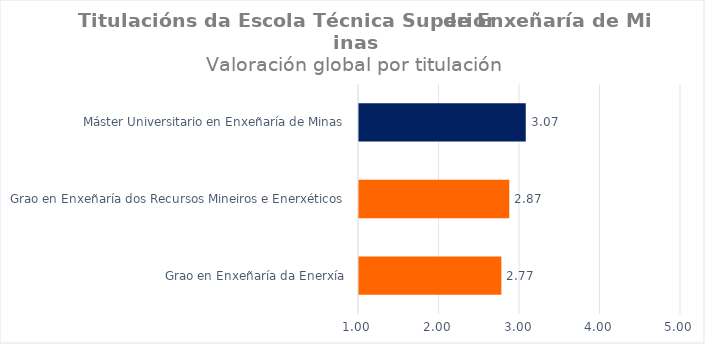
| Category | Series 0 |
|---|---|
| Grao en Enxeñaría da Enerxía | 2.769 |
| Grao en Enxeñaría dos Recursos Mineiros e Enerxéticos | 2.867 |
| Máster Universitario en Enxeñaría de Minas | 3.071 |